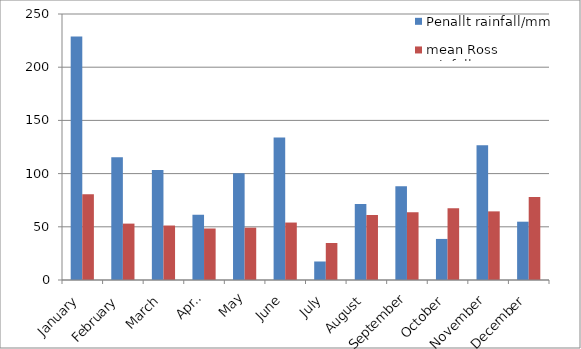
| Category | Penallt rainfall/mm | mean Ross rainfall/mm |
|---|---|---|
| January | 228.8 | 80.7 |
| February | 115.4 | 53 |
| March | 103.4 | 51.2 |
| April | 61.4 | 48.4 |
| May | 100.4 | 49.2 |
| June | 134 | 54 |
| July | 17.4 | 34.8 |
| August | 71.4 | 61.1 |
| September | 88.2 | 63.7 |
| October | 38.6 | 67.5 |
| November | 126.6 | 64.5 |
| December | 54.8 | 78.1 |